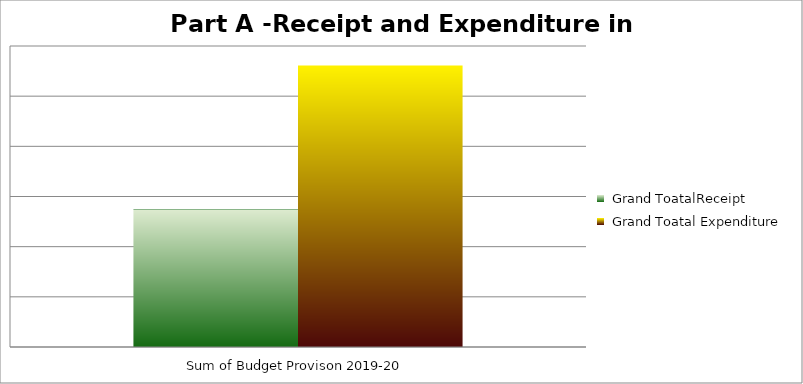
| Category |  Grand ToatalReceipt |  Grand Toatal Expenditure |
|---|---|---|
| Sum of Budget Provison 2019-20 | 137.008 | 280.601 |